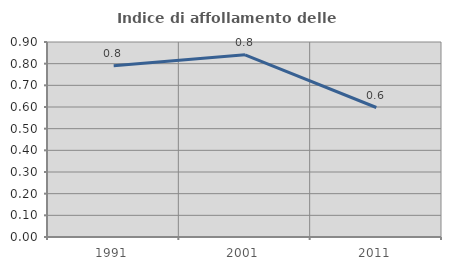
| Category | Indice di affollamento delle abitazioni  |
|---|---|
| 1991.0 | 0.791 |
| 2001.0 | 0.841 |
| 2011.0 | 0.598 |